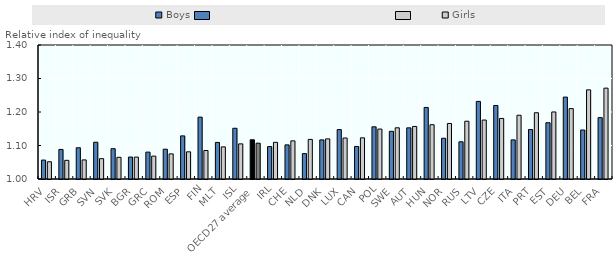
| Category | Boys | Girls |
|---|---|---|
| HRV | 1.056 | 1.051 |
| ISR | 1.088 | 1.056 |
| GRB | 1.093 | 1.057 |
| SVN | 1.11 | 1.061 |
| SVK | 1.09 | 1.065 |
| BGR | 1.066 | 1.065 |
| GRC | 1.08 | 1.068 |
| ROM | 1.089 | 1.075 |
| ESP | 1.129 | 1.081 |
| FIN | 1.185 | 1.085 |
| MLT | 1.109 | 1.096 |
| ISL | 1.151 | 1.105 |
| OECD27 average | 1.117 | 1.107 |
| IRL | 1.097 | 1.109 |
| CHE | 1.102 | 1.114 |
| NLD | 1.076 | 1.118 |
| DNK | 1.117 | 1.12 |
| LUX | 1.148 | 1.122 |
| CAN | 1.097 | 1.123 |
| POL | 1.156 | 1.149 |
| SWE | 1.142 | 1.153 |
| AUT | 1.153 | 1.157 |
| HUN | 1.214 | 1.162 |
| NOR | 1.122 | 1.166 |
| RUS | 1.111 | 1.173 |
| LTV | 1.232 | 1.176 |
| CZE | 1.219 | 1.181 |
| ITA | 1.117 | 1.19 |
| PRT | 1.148 | 1.198 |
| EST | 1.168 | 1.2 |
| DEU | 1.244 | 1.21 |
| BEL | 1.146 | 1.266 |
| FRA | 1.183 | 1.271 |